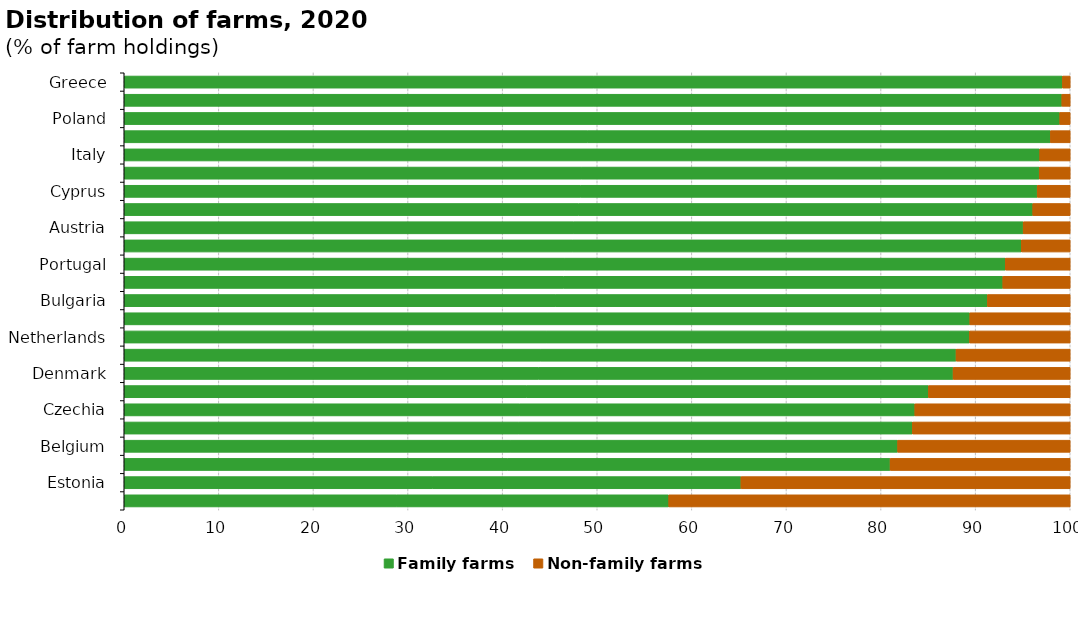
| Category | Family farms | Non-family farms |
|---|---|---|
| Greece | 99.182 | 0.818 |
| Romania | 99.114 | 0.886 |
| Poland | 98.892 | 1.108 |
| Malta | 97.908 | 2.092 |
| Italy | 96.776 | 3.224 |
| Croatia | 96.72 | 3.28 |
| Cyprus | 96.508 | 3.492 |
| Latvia | 96.04 | 3.96 |
| Austria | 95.026 | 4.974 |
| Hungary | 94.828 | 5.172 |
| Portugal | 93.132 | 6.868 |
| Luxembourg | 92.876 | 7.124 |
| Bulgaria | 91.245 | 8.755 |
| Ireland | 89.383 | 10.617 |
| Netherlands | 89.351 | 10.649 |
| Sweden | 87.932 | 12.068 |
| Denmark | 87.619 | 12.381 |
| Finland | 85.011 | 14.989 |
| Czechia | 83.573 | 16.427 |
| Germany | 83.316 | 16.684 |
| Belgium | 81.756 | 18.244 |
| Slovakia | 80.96 | 19.04 |
| Estonia | 65.193 | 34.807 |
| France | 57.561 | 42.439 |